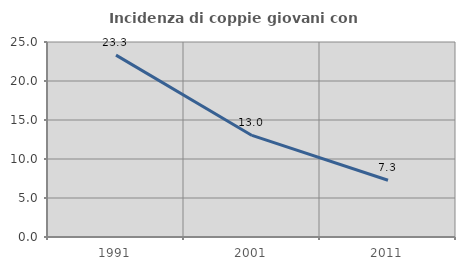
| Category | Incidenza di coppie giovani con figli |
|---|---|
| 1991.0 | 23.32 |
| 2001.0 | 13.022 |
| 2011.0 | 7.272 |